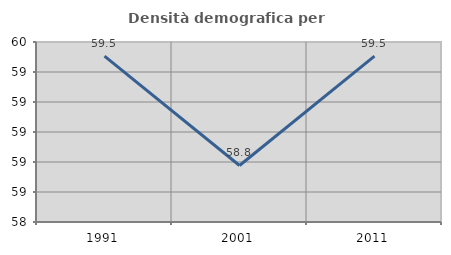
| Category | Densità demografica |
|---|---|
| 1991.0 | 59.505 |
| 2001.0 | 58.777 |
| 2011.0 | 59.505 |